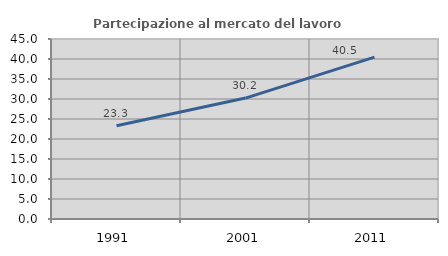
| Category | Partecipazione al mercato del lavoro  femminile |
|---|---|
| 1991.0 | 23.318 |
| 2001.0 | 30.233 |
| 2011.0 | 40.465 |